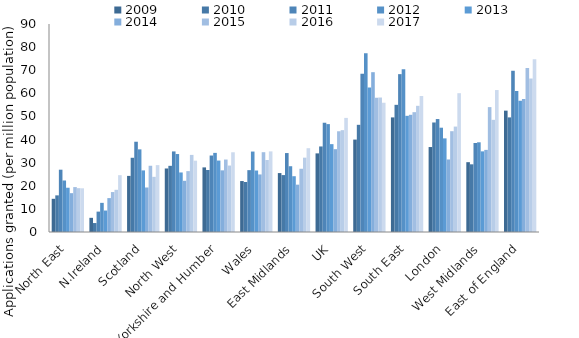
| Category | 2009 | 2010 | 2011 | 2012 | 2013 | 2014 | 2015 | 2016 | 2017 |
|---|---|---|---|---|---|---|---|---|---|
| North East | 14.367 | 15.849 | 26.96 | 22.287 | 19.153 | 16.802 | 19.432 | 18.964 | 18.906 |
| N.Ireland | 6.134 | 3.879 | 8.819 | 12.612 | 9.291 | 14.67 | 17.282 | 18.259 | 24.588 |
| Scotland | 24.274 | 32.116 | 39.057 | 35.757 | 26.653 | 19.261 | 28.662 | 23.868 | 28.941 |
| North West | 27.483 | 28.633 | 34.864 | 33.736 | 25.762 | 22.151 | 26.341 | 33.361 | 30.86 |
| Yorkshire and Humber | 27.952 | 26.833 | 33.093 | 34.23 | 30.911 | 26.679 | 31.353 | 28.754 | 34.495 |
| Wales | 22.047 | 21.639 | 26.764 | 34.807 | 26.603 | 24.903 | 34.526 | 31.158 | 34.878 |
| East Midlands | 25.494 | 24.628 | 34.161 | 28.46 | 24.138 | 20.486 | 27.366 | 32.167 | 36.255 |
| UK | 34.018 | 37.014 | 47.278 | 46.684 | 38.015 | 35.838 | 43.588 | 44.068 | 49.364 |
| South West | 39.986 | 46.376 | 68.48 | 77.345 | 62.48 | 69.146 | 58.118 | 58.184 | 55.942 |
| South East | 49.582 | 55.026 | 68.302 | 70.373 | 50.266 | 50.71 | 51.847 | 54.594 | 58.805 |
| London | 36.764 | 47.386 | 48.876 | 45.133 | 40.511 | 31.384 | 43.614 | 45.612 | 60.057 |
| West Midlands | 30.21 | 29.285 | 38.512 | 38.811 | 34.89 | 35.531 | 54.04 | 48.53 | 61.426 |
| East of England | 52.509 | 49.592 | 69.767 | 60.956 | 56.789 | 57.501 | 70.935 | 66.406 | 74.736 |